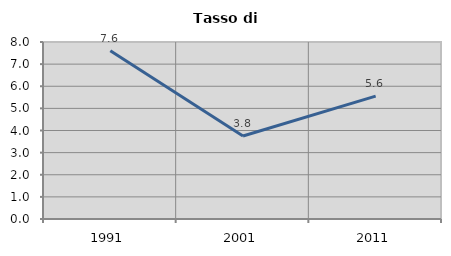
| Category | Tasso di disoccupazione   |
|---|---|
| 1991.0 | 7.602 |
| 2001.0 | 3.753 |
| 2011.0 | 5.556 |